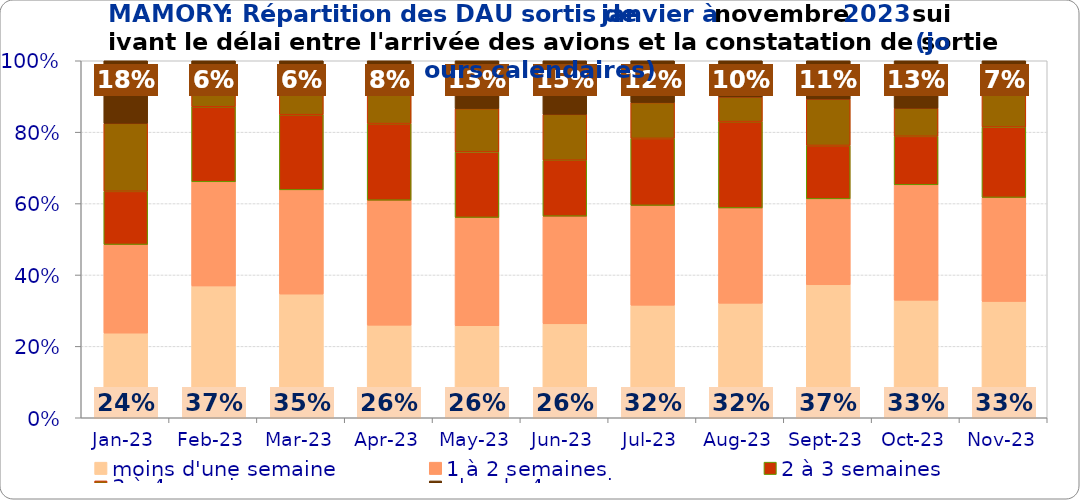
| Category | moins d'une semaine | 1 à 2 semaines | 2 à 3 semaines | 3 à 4 semaines | plus de 4 semaines |
|---|---|---|---|---|---|
| 2023-01-01 | 0.237 | 0.248 | 0.149 | 0.19 | 0.175 |
| 2023-02-01 | 0.369 | 0.292 | 0.21 | 0.066 | 0.062 |
| 2023-03-01 | 0.346 | 0.292 | 0.211 | 0.094 | 0.057 |
| 2023-04-01 | 0.259 | 0.35 | 0.215 | 0.101 | 0.075 |
| 2023-05-01 | 0.258 | 0.303 | 0.184 | 0.121 | 0.134 |
| 2023-06-01 | 0.263 | 0.302 | 0.157 | 0.129 | 0.15 |
| 2023-07-01 | 0.315 | 0.279 | 0.188 | 0.1 | 0.117 |
| 2023-08-01 | 0.321 | 0.267 | 0.242 | 0.069 | 0.101 |
| 2023-09-01 | 0.372 | 0.241 | 0.149 | 0.13 | 0.107 |
| 2023-10-01 | 0.329 | 0.323 | 0.136 | 0.079 | 0.133 |
| 2023-11-01 | 0.326 | 0.291 | 0.197 | 0.116 | 0.069 |